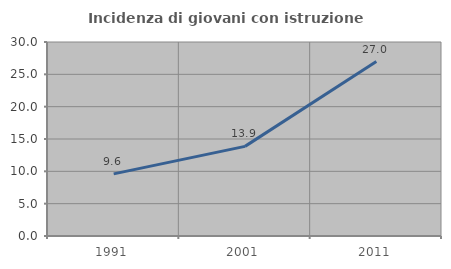
| Category | Incidenza di giovani con istruzione universitaria |
|---|---|
| 1991.0 | 9.611 |
| 2001.0 | 13.86 |
| 2011.0 | 26.972 |